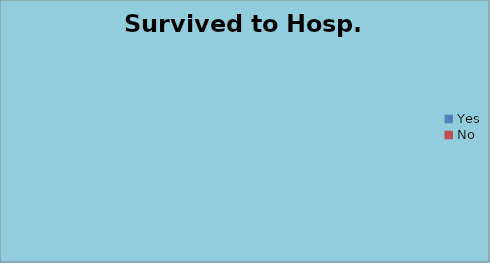
| Category | Survived to Hosp. Admit  |
|---|---|
| Yes | 0 |
| No | 0 |